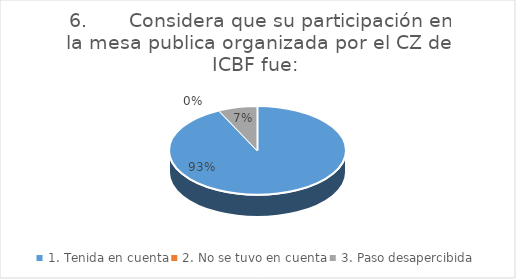
| Category | Series 0 |
|---|---|
| 1. Tenida en cuenta | 26 |
| 2. No se tuvo en cuenta | 0 |
| 3. Paso desapercibida | 2 |